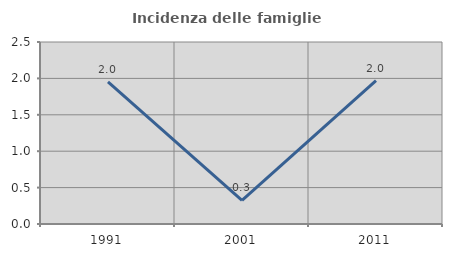
| Category | Incidenza delle famiglie numerose |
|---|---|
| 1991.0 | 1.953 |
| 2001.0 | 0.324 |
| 2011.0 | 1.969 |